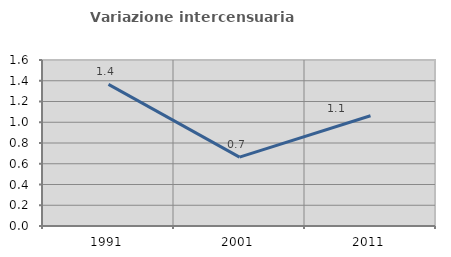
| Category | Variazione intercensuaria annua |
|---|---|
| 1991.0 | 1.366 |
| 2001.0 | 0.664 |
| 2011.0 | 1.063 |